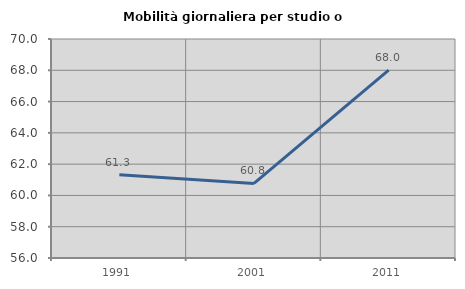
| Category | Mobilità giornaliera per studio o lavoro |
|---|---|
| 1991.0 | 61.325 |
| 2001.0 | 60.768 |
| 2011.0 | 68.016 |